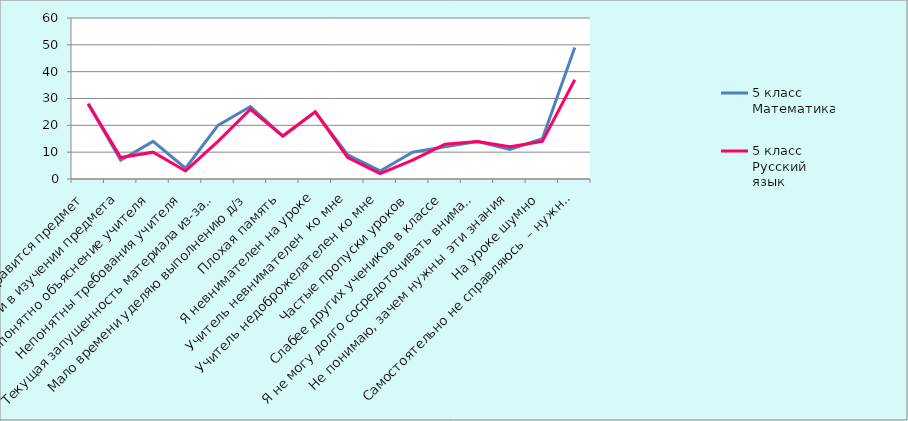
| Category | 5 класс Математика | 5 класс Русский язык |
|---|---|---|
| Не нравится предмет | 28 | 28 |
| Нет потребности в изучении предмета | 7 | 8 |
| Непонятно объяснение учителя | 14 | 10 |
| Непонятны требования учителя | 4 | 3 |
| Текущая запущенность материала из-за лени | 20 | 14 |
| Мало времени уделяю выполнению д/з | 27 | 26 |
| Плохая память | 16 | 16 |
| Я невнимателен на уроке | 25 | 25 |
| Учитель невнимателен  ко мне | 9 | 8 |
| Учитель недоброжелателен ко мне | 3 | 2 |
| Частые пропуски уроков | 10 | 7 |
| Слабее других учеников в классе | 12 | 13 |
| Я не могу долго сосредоточивать внимание | 14 | 14 |
| Не понимаю, зачем нужны  эти знания | 11 | 12 |
| На уроке шумно | 15 | 14 |
| Самостоятельно не справляюсь  – нужна помощь  | 49 | 37 |